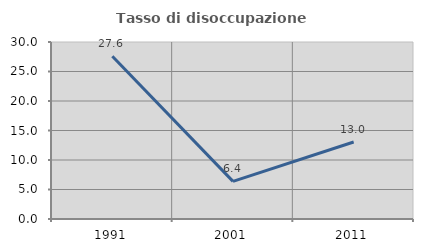
| Category | Tasso di disoccupazione giovanile  |
|---|---|
| 1991.0 | 27.586 |
| 2001.0 | 6.383 |
| 2011.0 | 13.043 |